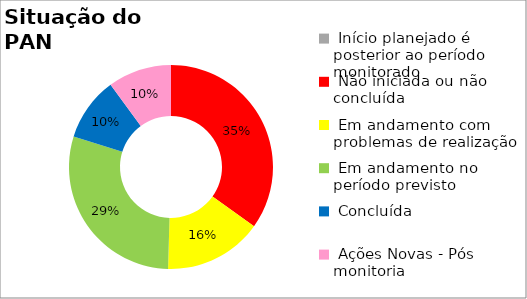
| Category | Series 0 |
|---|---|
|  Início planejado é posterior ao período monitorado | 0 |
|  Não iniciada ou não concluída | 0.349 |
|  Em andamento com problemas de realização | 0.156 |
|  Em andamento no período previsto  | 0.294 |
|  Concluída | 0.101 |
|  Ações Novas - Pós monitoria | 0.101 |